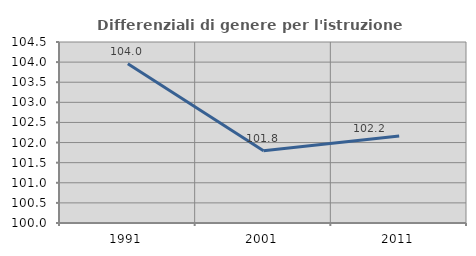
| Category | Differenziali di genere per l'istruzione superiore |
|---|---|
| 1991.0 | 103.96 |
| 2001.0 | 101.794 |
| 2011.0 | 102.165 |